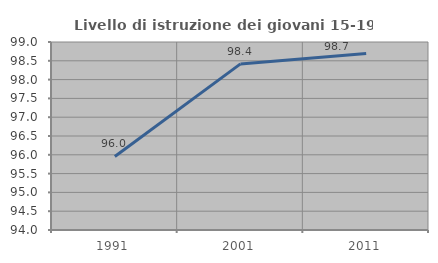
| Category | Livello di istruzione dei giovani 15-19 anni |
|---|---|
| 1991.0 | 95.956 |
| 2001.0 | 98.418 |
| 2011.0 | 98.694 |